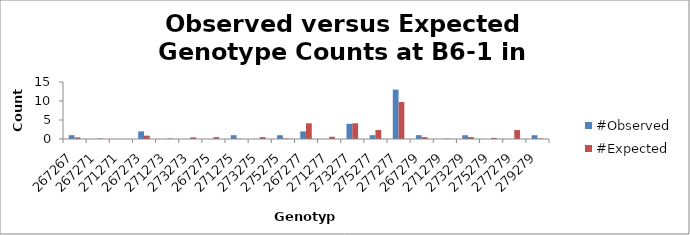
| Category | #Observed | #Expected |
|---|---|---|
| 267267.0 | 1 | 0.438 |
| 267271.0 | 0 | 0.125 |
| 271271.0 | 0 | 0.009 |
| 267273.0 | 2 | 0.875 |
| 271273.0 | 0 | 0.125 |
| 273273.0 | 0 | 0.438 |
| 267275.0 | 0 | 0.5 |
| 271275.0 | 1 | 0.071 |
| 273275.0 | 0 | 0.5 |
| 275275.0 | 1 | 0.143 |
| 267277.0 | 2 | 4.125 |
| 271277.0 | 0 | 0.589 |
| 273277.0 | 4 | 4.125 |
| 275277.0 | 1 | 2.357 |
| 277277.0 | 13 | 9.723 |
| 267279.0 | 1 | 0.5 |
| 271279.0 | 0 | 0.071 |
| 273279.0 | 1 | 0.5 |
| 275279.0 | 0 | 0.286 |
| 277279.0 | 0 | 2.357 |
| 279279.0 | 1 | 0.143 |